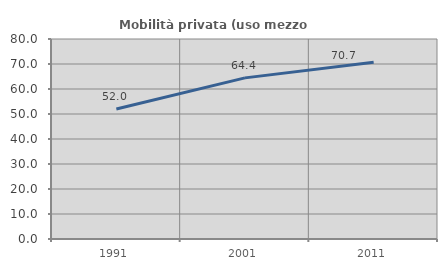
| Category | Mobilità privata (uso mezzo privato) |
|---|---|
| 1991.0 | 52.02 |
| 2001.0 | 64.449 |
| 2011.0 | 70.743 |